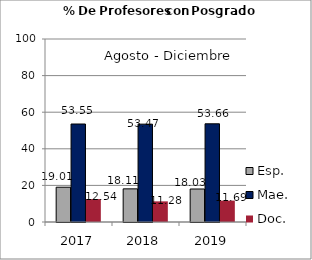
| Category | Esp. | Mae. | Doc. |
|---|---|---|---|
| 2017.0 | 19.01 | 53.55 | 12.54 |
| 2018.0 | 18.11 | 53.47 | 11.28 |
| 2019.0 | 18.03 | 53.66 | 11.69 |